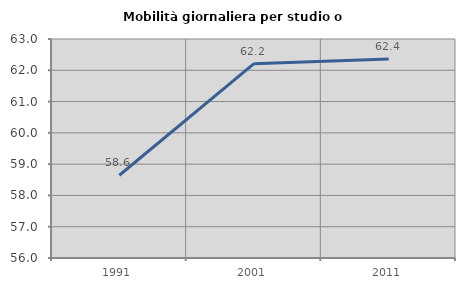
| Category | Mobilità giornaliera per studio o lavoro |
|---|---|
| 1991.0 | 58.645 |
| 2001.0 | 62.21 |
| 2011.0 | 62.357 |